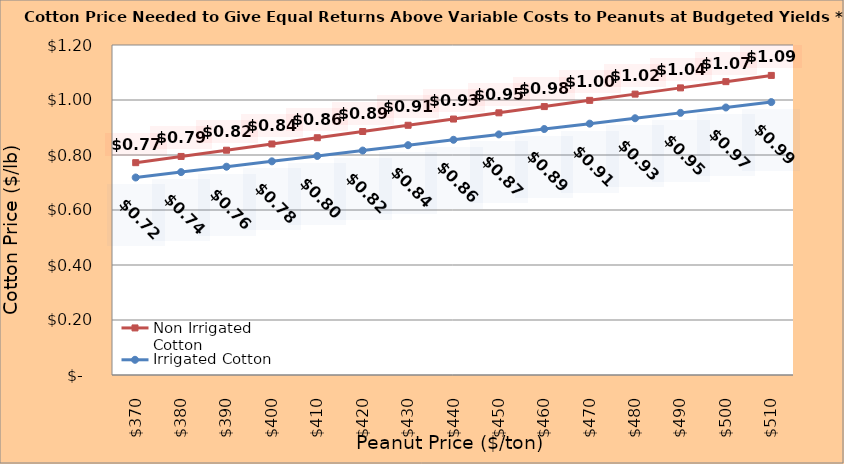
| Category | Non Irrigated Cotton | Irrigated Cotton |
|---|---|---|
| 370.0 | 0.772 | 0.718 |
| 380.0 | 0.795 | 0.738 |
| 390.0 | 0.817 | 0.757 |
| 400.0 | 0.84 | 0.777 |
| 410.0 | 0.863 | 0.797 |
| 420.0 | 0.885 | 0.816 |
| 430.0 | 0.908 | 0.836 |
| 440.0 | 0.931 | 0.855 |
| 450.0 | 0.953 | 0.875 |
| 460.0 | 0.976 | 0.894 |
| 470.0 | 0.999 | 0.914 |
| 480.0 | 1.021 | 0.934 |
| 490.0 | 1.044 | 0.953 |
| 500.0 | 1.067 | 0.973 |
| 510.0 | 1.089 | 0.992 |